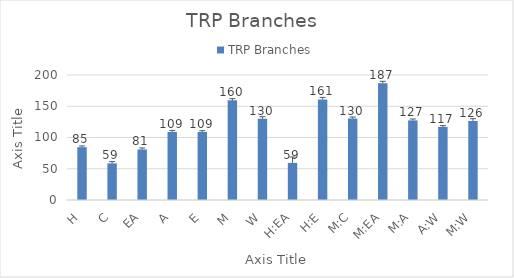
| Category | TRP Branches  |
|---|---|
| H | 84.539 |
| C | 58.619 |
| EA | 80.935 |
| A | 108.996 |
| E | 108.87 |
| M | 159.543 |
| W | 130.052 |
| H:EA | 59.375 |
| H:E | 160.966 |
| M:C | 130.395 |
| M:EA | 186.912 |
| M:A | 127.395 |
| A:W | 116.989 |
| M:W | 126.434 |